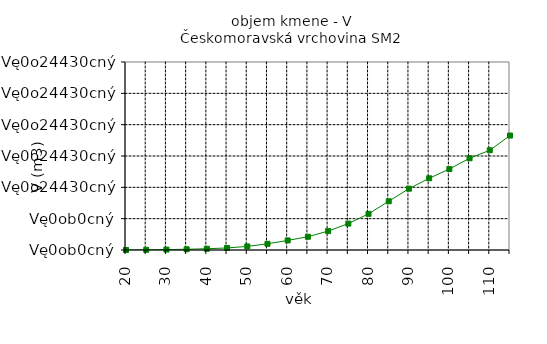
| Category | V |
|---|---|
| 20.0 | 0 |
| 25.0 | 0.003 |
| 30.0 | 0.007 |
| 35.0 | 0.012 |
| 40.0 | 0.02 |
| 45.0 | 0.033 |
| 50.0 | 0.057 |
| 55.0 | 0.099 |
| 60.0 | 0.153 |
| 65.0 | 0.212 |
| 70.0 | 0.302 |
| 75.0 | 0.421 |
| 80.0 | 0.577 |
| 85.0 | 0.778 |
| 90.0 | 0.979 |
| 95.0 | 1.144 |
| 100.0 | 1.292 |
| 105.0 | 1.464 |
| 110.0 | 1.592 |
| 115.0 | 1.827 |